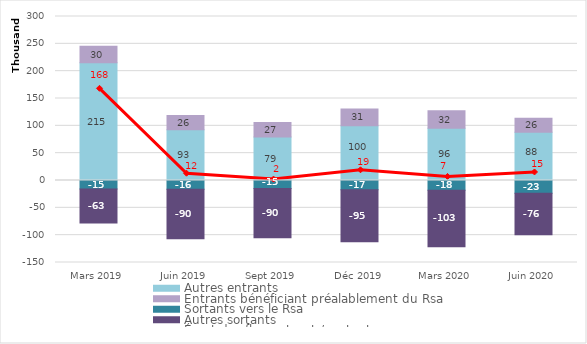
| Category | Autres entrants | Entrants bénéficiant préalablement du Rsa | Sortants vers le Rsa | Autres sortants |
|---|---|---|---|---|
| Mars 2019 | 215317 | 30314 | -15335 | -62557 |
| Juin 2019 | 92845 | 25926 | -16127 | -90244 |
| Sept 2019 | 79444 | 26798 | -14583 | -89999 |
| Déc 2019 | 100224 | 30544 | -16853 | -95229 |
| Mars 2020 | 95536 | 32027 | -17635 | -103428 |
| Juin 2020 | 88088 | 25919 | -23213 | -76107 |